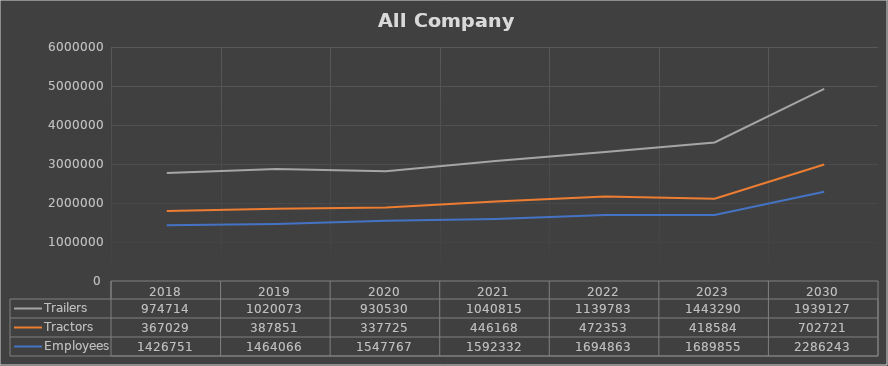
| Category | Employees | Tractors | Trailers |
|---|---|---|---|
| 2018.0 | 1426751 | 367029 | 974714 |
| 2019.0 | 1464066 | 387851 | 1020073 |
| 2020.0 | 1547767 | 337725 | 930530 |
| 2021.0 | 1592332 | 446168 | 1040815 |
| 2022.0 | 1694863 | 472353 | 1139783 |
| 2023.0 | 1689855 | 418584 | 1443290 |
| 2030.0 | 2286243.332 | 702721.165 | 1939126.959 |